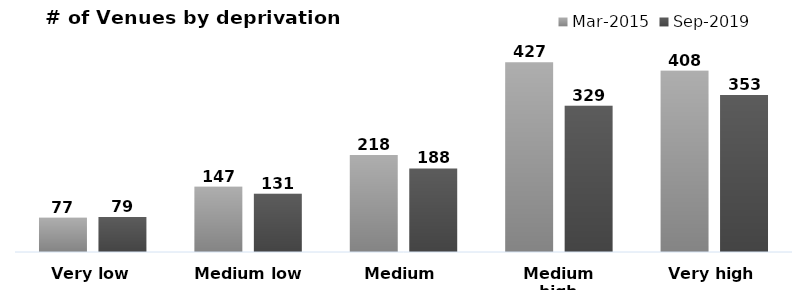
| Category | Mar-2015 | Sep-2019 |
|---|---|---|
| Very low | 77 | 79 |
| Medium low | 147 | 131 |
| Medium | 218 | 188 |
| Medium high | 427 | 329 |
| Very high | 408 | 353 |